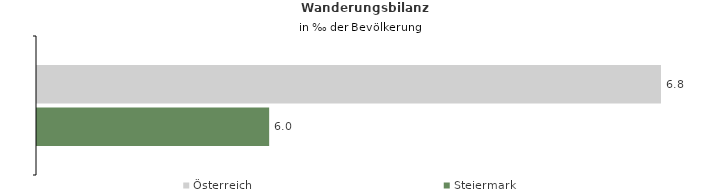
| Category | Österreich | Steiermark |
|---|---|---|
| Wanderungsrate in ‰ der Bevölkerung, Periode 2018-2022 | 6.822 | 5.992 |